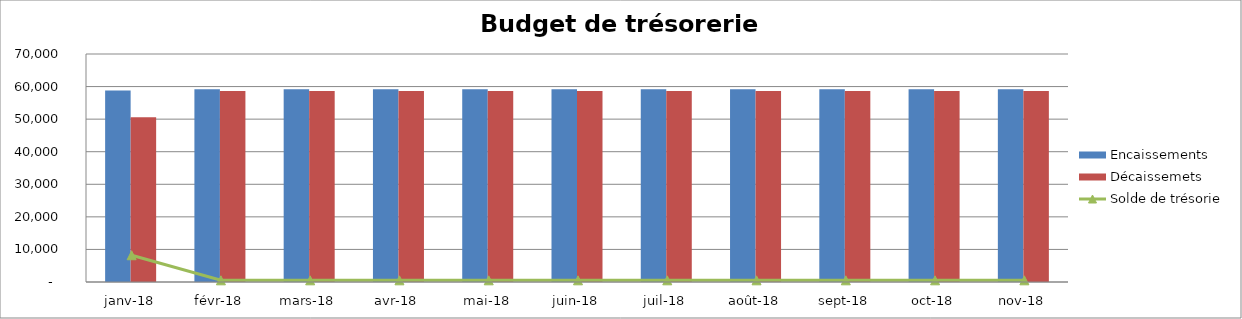
| Category | Encaissements | Décaissemets |
|---|---|---|
| janv-18 | 58794.8 | 50580.717 |
| févr-18 | 59149.7 | 58632.617 |
| mars-18 | 59149.7 | 58632.617 |
| avr-18 | 59149.7 | 58632.617 |
| mai-18 | 59149.7 | 58632.617 |
| juin-18 | 59149.7 | 58632.617 |
| juil-18 | 59149.7 | 58632.617 |
| août-18 | 59149.7 | 58632.617 |
| sept-18 | 59149.7 | 58632.617 |
| oct-18 | 59149.7 | 58632.617 |
| nov-18 | 59149.7 | 58632.617 |